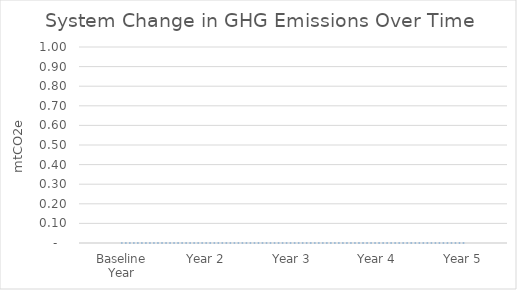
| Category | Series 0 |
|---|---|
| Baseline Year | 0 |
| Year 2 | 0 |
| Year 3 | 0 |
| Year 4 | 0 |
| Year 5 | 0 |